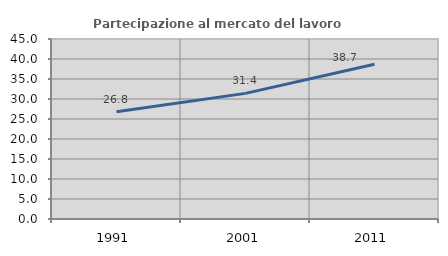
| Category | Partecipazione al mercato del lavoro  femminile |
|---|---|
| 1991.0 | 26.79 |
| 2001.0 | 31.403 |
| 2011.0 | 38.679 |